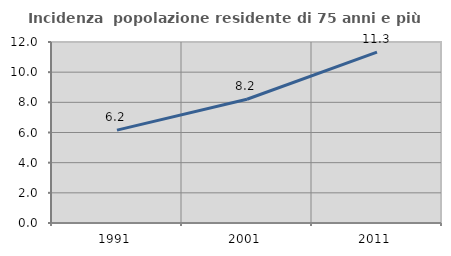
| Category | Incidenza  popolazione residente di 75 anni e più |
|---|---|
| 1991.0 | 6.156 |
| 2001.0 | 8.205 |
| 2011.0 | 11.335 |